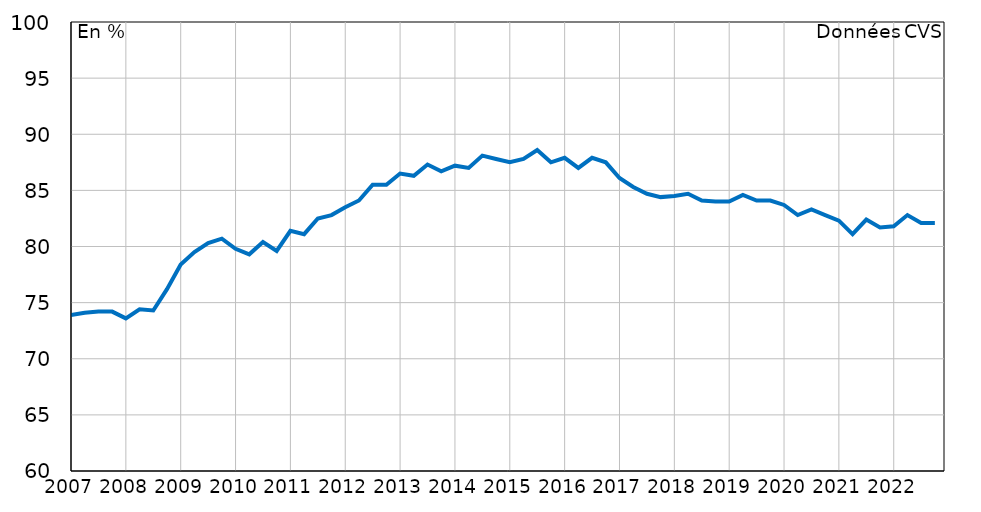
| Category | Ensemble |
|---|---|
| 2007-01-01 | 73.9 |
| 2007-04-01 | 74.1 |
| 2007-07-01 | 74.2 |
| 2007-10-01 | 74.2 |
| 2008-01-01 | 73.6 |
| 2008-04-01 | 74.4 |
| 2008-07-01 | 74.3 |
| 2008-10-01 | 76.2 |
| 2009-01-01 | 78.4 |
| 2009-04-01 | 79.5 |
| 2009-07-01 | 80.3 |
| 2009-10-01 | 80.7 |
| 2010-01-01 | 79.8 |
| 2010-04-01 | 79.3 |
| 2010-07-01 | 80.4 |
| 2010-10-01 | 79.6 |
| 2011-01-01 | 81.4 |
| 2011-04-01 | 81.1 |
| 2011-07-01 | 82.5 |
| 2011-10-01 | 82.8 |
| 2012-01-01 | 83.5 |
| 2012-04-01 | 84.1 |
| 2012-07-01 | 85.5 |
| 2012-10-01 | 85.5 |
| 2013-01-01 | 86.5 |
| 2013-04-01 | 86.3 |
| 2013-07-01 | 87.3 |
| 2013-10-01 | 86.7 |
| 2014-01-01 | 87.2 |
| 2014-04-01 | 87 |
| 2014-07-01 | 88.1 |
| 2014-10-01 | 87.8 |
| 2015-01-01 | 87.5 |
| 2015-04-01 | 87.8 |
| 2015-07-01 | 88.6 |
| 2015-10-01 | 87.5 |
| 2016-01-01 | 87.9 |
| 2016-04-01 | 87 |
| 2016-07-01 | 87.9 |
| 2016-10-01 | 87.5 |
| 2017-01-01 | 86.1 |
| 2017-04-01 | 85.3 |
| 2017-07-01 | 84.7 |
| 2017-10-01 | 84.4 |
| 2018-01-01 | 84.5 |
| 2018-04-01 | 84.7 |
| 2018-07-01 | 84.1 |
| 2018-10-01 | 84 |
| 2019-01-01 | 84 |
| 2019-04-01 | 84.6 |
| 2019-07-01 | 84.1 |
| 2019-10-01 | 84.1 |
| 2020-01-01 | 83.7 |
| 2020-04-01 | 82.8 |
| 2020-07-01 | 83.3 |
| 2020-10-01 | 82.8 |
| 2021-01-01 | 82.3 |
| 2021-04-01 | 81.1 |
| 2021-07-01 | 82.4 |
| 2021-10-01 | 81.7 |
| 2022-01-01 | 81.8 |
| 2022-04-01 | 82.8 |
| 2022-07-01 | 82.1 |
| 2022-10-01 | 82.1 |